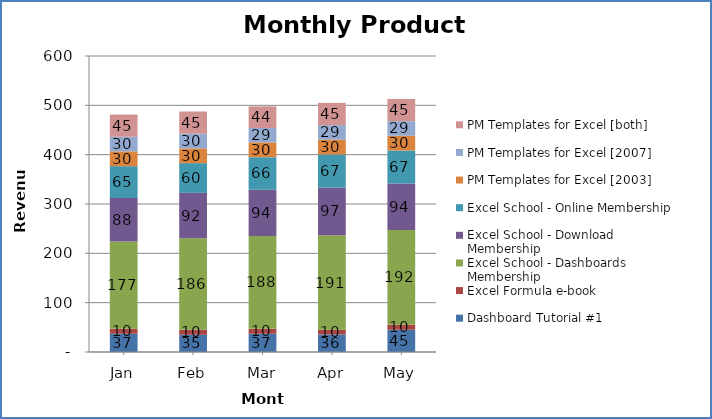
| Category | Dashboard Tutorial #1 | Excel Formula e-book | Excel School - Dashboards Membership | Excel School - Download Membership | Excel School - Online Membership | PM Templates for Excel [2003] | PM Templates for Excel [2007] | PM Templates for Excel [both] |
|---|---|---|---|---|---|---|---|---|
|  Jan  | 37 | 10 | 177.042 | 88.161 | 64.5 | 30 | 29.583 | 45 |
|  Feb  | 34.886 | 10 | 185.6 | 92.1 | 60.2 | 30 | 29.731 | 45 |
|  Mar  | 37 | 10 | 188.297 | 93.585 | 66.043 | 30 | 29.075 | 43.929 |
|  Apr  | 35.572 | 9.583 | 191.278 | 97 | 67 | 30 | 29.474 | 45 |
|  May  | 45.12 | 10 | 191.96 | 94.355 | 67 | 30 | 29.478 | 45 |